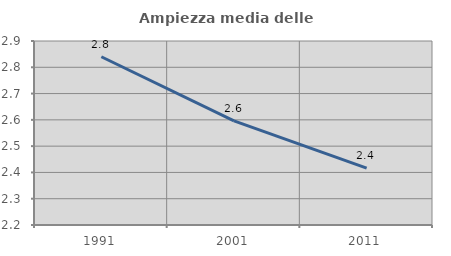
| Category | Ampiezza media delle famiglie |
|---|---|
| 1991.0 | 2.84 |
| 2001.0 | 2.596 |
| 2011.0 | 2.417 |